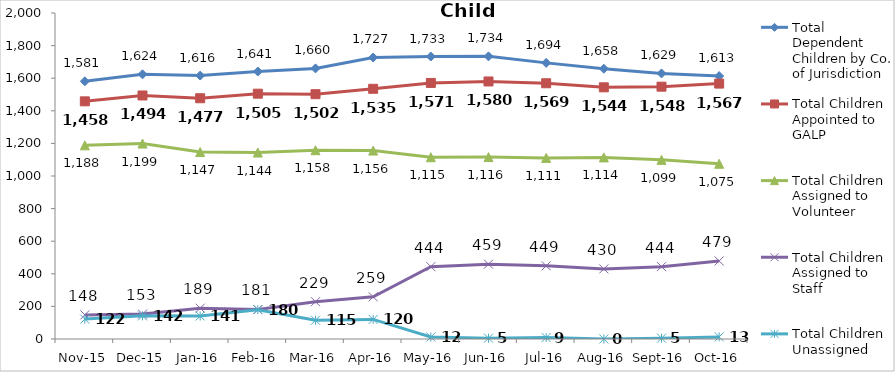
| Category | Total Dependent Children by Co. of Jurisdiction | Total Children Appointed to GALP | Total Children Assigned to Volunteer | Total Children Assigned to Staff | Total Children Unassigned |
|---|---|---|---|---|---|
| Nov-15 | 1581 | 1458 | 1188 | 148 | 122 |
| Dec-15 | 1624 | 1494 | 1199 | 153 | 142 |
| Jan-16 | 1616 | 1477 | 1147 | 189 | 141 |
| Feb-16 | 1641 | 1505 | 1144 | 181 | 180 |
| Mar-16 | 1660 | 1502 | 1158 | 229 | 115 |
| Apr-16 | 1727 | 1535 | 1156 | 259 | 120 |
| May-16 | 1733 | 1571 | 1115 | 444 | 12 |
| Jun-16 | 1734 | 1580 | 1116 | 459 | 5 |
| Jul-16 | 1694 | 1569 | 1111 | 449 | 9 |
| Aug-16 | 1658 | 1544 | 1114 | 430 | 0 |
| Sep-16 | 1629 | 1548 | 1099 | 444 | 5 |
| Oct-16 | 1613 | 1567 | 1075 | 479 | 13 |